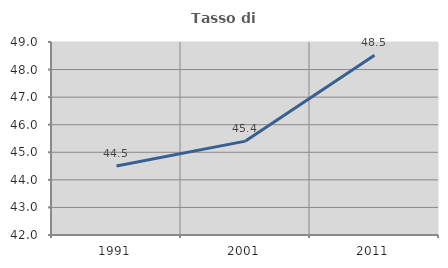
| Category | Tasso di occupazione   |
|---|---|
| 1991.0 | 44.5 |
| 2001.0 | 45.405 |
| 2011.0 | 48.521 |